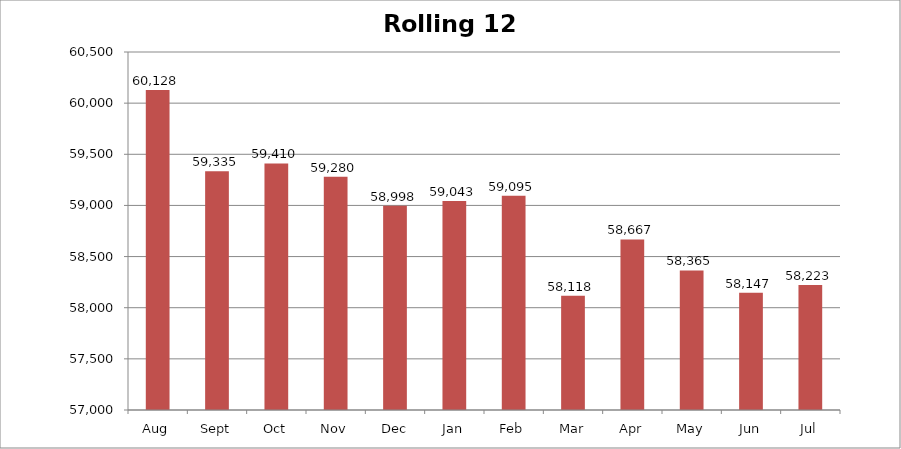
| Category | Rolling 12 Month |
|---|---|
| Aug | 60128 |
| Sept | 59335 |
| Oct | 59410 |
| Nov | 59280 |
| Dec | 58998 |
| Jan | 59043 |
| Feb | 59095 |
| Mar | 58118 |
| Apr | 58667 |
| May | 58365 |
| Jun | 58147 |
| Jul | 58223 |